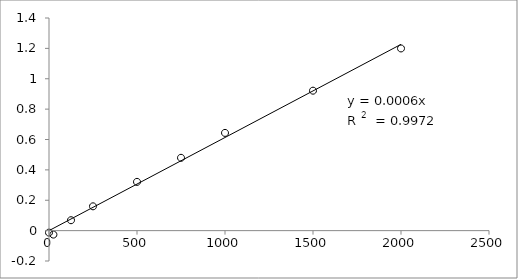
| Category | Series 0 |
|---|---|
| 2000.0 | 1.2 |
| 1500.0 | 0.922 |
| 1000.0 | 0.644 |
| 750.0 | 0.48 |
| 500.0 | 0.321 |
| 250.0 | 0.16 |
| 125.0 | 0.068 |
| 25.0 | -0.026 |
| 0.0 | -0.013 |